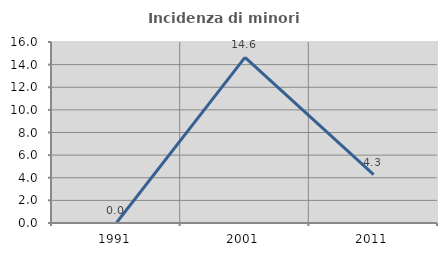
| Category | Incidenza di minori stranieri |
|---|---|
| 1991.0 | 0 |
| 2001.0 | 14.634 |
| 2011.0 | 4.286 |